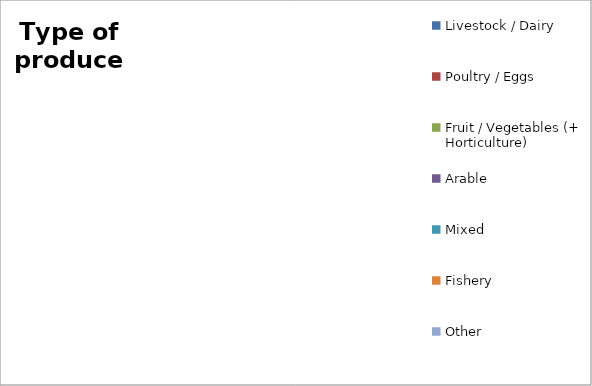
| Category | Series 0 |
|---|---|
| Livestock / Dairy | 0 |
| Poultry / Eggs | 0 |
| Fruit / Vegetables (+ Horticulture) | 0 |
| Arable | 0 |
| Mixed | 0 |
| Fishery | 0 |
| Other | 0 |